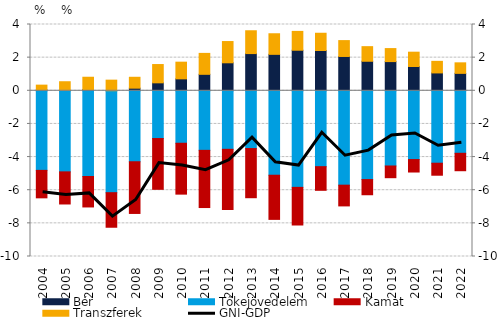
| Category | Bér | Tőkejövedelem | Kamat | Transzferek |
|---|---|---|---|---|
| 2004.0 | 0.05 | -4.802 | -1.658 | 0.291 |
| 2005.0 | 0.026 | -4.892 | -1.939 | 0.52 |
| 2006.0 | 0.074 | -5.171 | -1.84 | 0.743 |
| 2007.0 | 0.004 | -6.149 | -2.086 | 0.638 |
| 2008.0 | 0.158 | -4.282 | -3.12 | 0.657 |
| 2009.0 | 0.48 | -2.882 | -3.065 | 1.104 |
| 2010.0 | 0.721 | -3.166 | -3.07 | 1.006 |
| 2011.0 | 0.993 | -3.594 | -3.452 | 1.264 |
| 2012.0 | 1.689 | -3.532 | -3.632 | 1.282 |
| 2013.0 | 2.245 | -3.487 | -2.966 | 1.377 |
| 2014.0 | 2.199 | -5.096 | -2.664 | 1.243 |
| 2015.0 | 2.447 | -5.827 | -2.272 | 1.137 |
| 2016.0 | 2.431 | -4.579 | -1.427 | 1.041 |
| 2017.0 | 2.071 | -5.696 | -1.251 | 0.958 |
| 2018.0 | 1.782 | -5.358 | -0.916 | 0.881 |
| 2019.0 | 1.762 | -4.538 | -0.707 | 0.785 |
| 2020.0 | 1.467 | -4.15 | -0.752 | 0.862 |
| 2021.0 | 1.077 | -4.371 | -0.725 | 0.699 |
| 2022.0 | 1.051 | -3.772 | -1.052 | 0.636 |